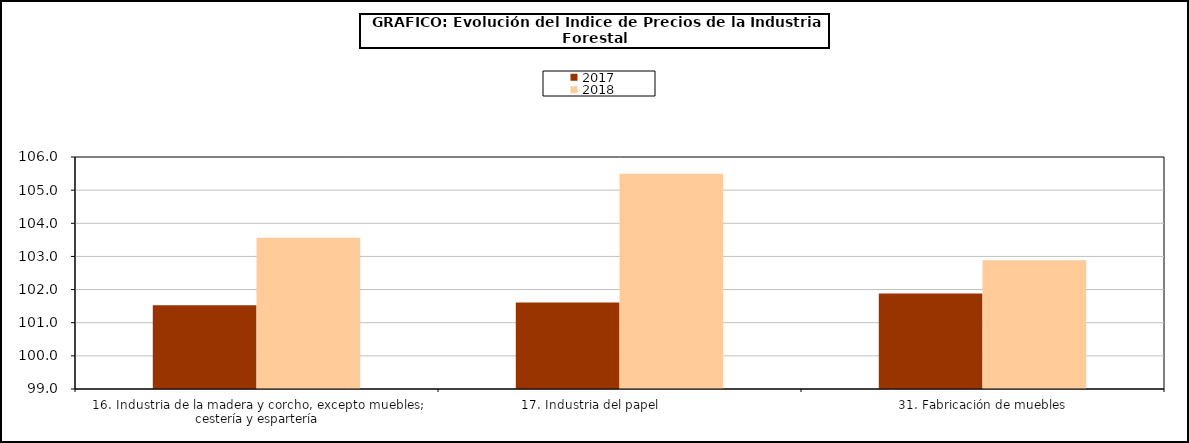
| Category | 2017 | 2018 |
|---|---|---|
| 16. Industria de la madera y corcho, excepto muebles; cestería y espartería | 101.53 | 103.567 |
| 17. Industria del papel                | 101.611 | 105.498 |
| 31. Fabricación de muebles | 101.884 | 102.886 |